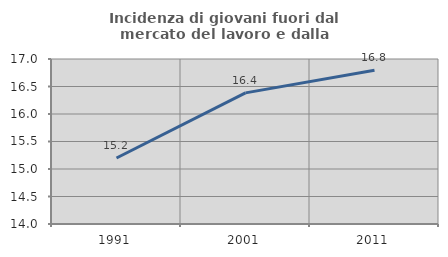
| Category | Incidenza di giovani fuori dal mercato del lavoro e dalla formazione  |
|---|---|
| 1991.0 | 15.2 |
| 2001.0 | 16.384 |
| 2011.0 | 16.794 |